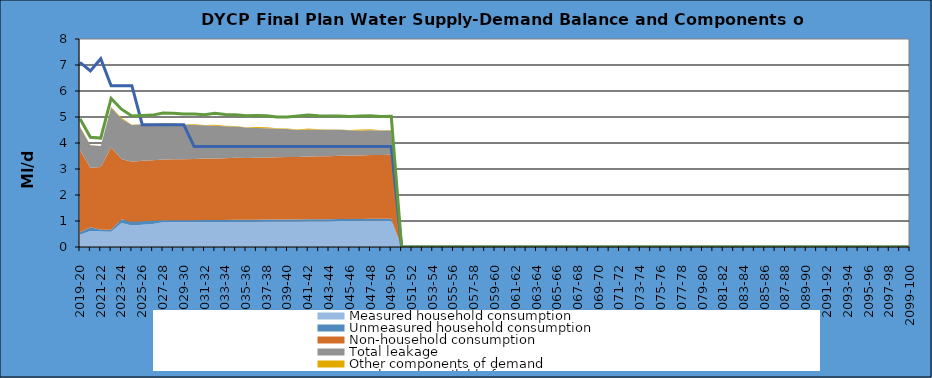
| Category | Total water available for use | Total demand + target headroom (final plan) |
|---|---|---|
| 0 | 7.1 | 4.93 |
| 1 | 6.77 | 4.22 |
| 2 | 7.24 | 4.188 |
| 3 | 6.204 | 5.712 |
| 4 | 6.204 | 5.3 |
| 5 | 6.204 | 5.036 |
| 6 | 4.704 | 5.059 |
| 7 | 4.704 | 5.073 |
| 8 | 4.704 | 5.152 |
| 9 | 4.704 | 5.145 |
| 10 | 4.704 | 5.114 |
| 11 | 3.864 | 5.111 |
| 12 | 3.864 | 5.087 |
| 13 | 3.864 | 5.143 |
| 14 | 3.864 | 5.1 |
| 15 | 3.864 | 5.091 |
| 16 | 3.864 | 5.05 |
| 17 | 3.864 | 5.057 |
| 18 | 3.864 | 5.048 |
| 19 | 3.864 | 5.004 |
| 20 | 3.864 | 5.001 |
| 21 | 3.864 | 5.035 |
| 22 | 3.864 | 5.076 |
| 23 | 3.864 | 5.045 |
| 24 | 3.864 | 5.038 |
| 25 | 3.864 | 5.042 |
| 26 | 3.864 | 5.023 |
| 27 | 3.864 | 5.042 |
| 28 | 3.864 | 5.046 |
| 29 | 3.864 | 5.015 |
| 30 | 3.864 | 5.023 |
| 31 | 0 | 0 |
| 32 | 0 | 0 |
| 33 | 0 | 0 |
| 34 | 0 | 0 |
| 35 | 0 | 0 |
| 36 | 0 | 0 |
| 37 | 0 | 0 |
| 38 | 0 | 0 |
| 39 | 0 | 0 |
| 40 | 0 | 0 |
| 41 | 0 | 0 |
| 42 | 0 | 0 |
| 43 | 0 | 0 |
| 44 | 0 | 0 |
| 45 | 0 | 0 |
| 46 | 0 | 0 |
| 47 | 0 | 0 |
| 48 | 0 | 0 |
| 49 | 0 | 0 |
| 50 | 0 | 0 |
| 51 | 0 | 0 |
| 52 | 0 | 0 |
| 53 | 0 | 0 |
| 54 | 0 | 0 |
| 55 | 0 | 0 |
| 56 | 0 | 0 |
| 57 | 0 | 0 |
| 58 | 0 | 0 |
| 59 | 0 | 0 |
| 60 | 0 | 0 |
| 61 | 0 | 0 |
| 62 | 0 | 0 |
| 63 | 0 | 0 |
| 64 | 0 | 0 |
| 65 | 0 | 0 |
| 66 | 0 | 0 |
| 67 | 0 | 0 |
| 68 | 0 | 0 |
| 69 | 0 | 0 |
| 70 | 0 | 0 |
| 71 | 0 | 0 |
| 72 | 0 | 0 |
| 73 | 0 | 0 |
| 74 | 0 | 0 |
| 75 | 0 | 0 |
| 76 | 0 | 0 |
| 77 | 0 | 0 |
| 78 | 0 | 0 |
| 79 | 0 | 0 |
| 80 | 0 | 0 |